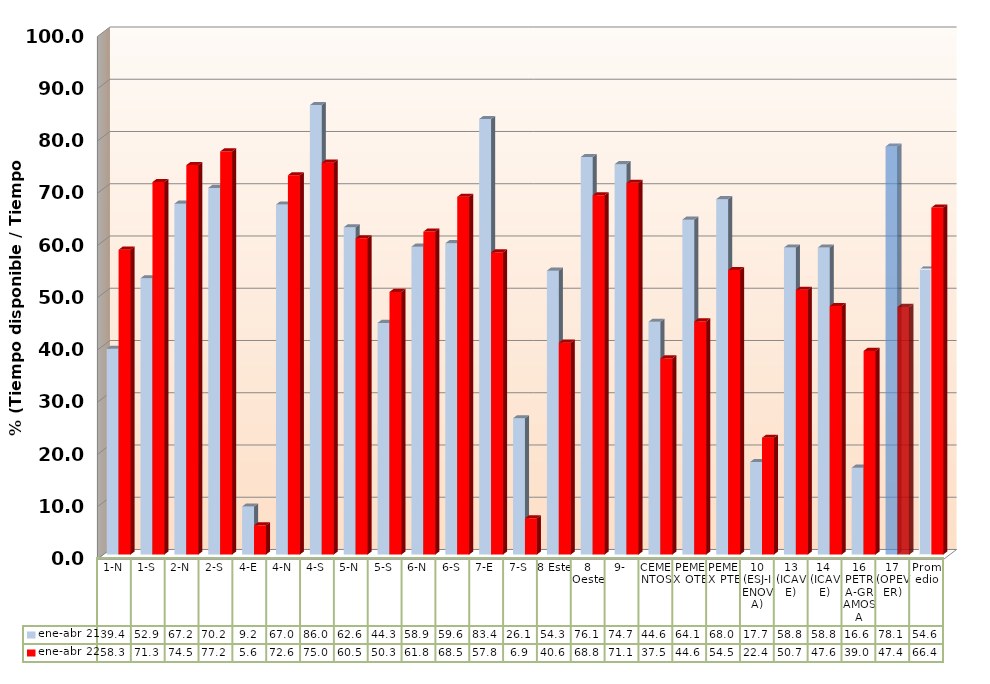
| Category | ene-abr 21 | ene-abr 22 |
|---|---|---|
| 1-N | 39.38 | 58.348 |
| 1-S | 52.884 | 71.292 |
| 2-N | 67.155 | 74.534 |
| 2-S | 70.172 | 77.151 |
| 4-E | 9.195 | 5.589 |
| 4-N | 66.994 | 72.596 |
| 4-S | 86.015 | 74.999 |
| 5-N | 62.631 | 60.538 |
| 5-S | 44.331 | 50.257 |
| 6-N | 58.917 | 61.807 |
| 6-S | 59.587 | 68.472 |
| 7-E | 83.36 | 57.828 |
| 7-S | 26.081 | 6.944 |
| 8 Este | 54.327 | 40.553 |
| 8 Oeste | 76.088 | 68.762 |
| 9- | 74.708 | 71.138 |
| CEMENTOS | 44.552 | 37.54 |
| PEMEX OTE | 64.096 | 44.622 |
| PEMEX PTE | 68.018 | 54.46 |
| 10 (ESJ-IENOVA) | 17.707 | 22.354 |
| 13 (ICAVE) | 58.758 | 50.665 |
| 14  (ICAVE) | 58.758 | 47.563 |
| 16 PETRA-GRAMOSA | 16.624 | 38.972 |
| 17 (OPEVER) | 78.093 | 47.386 |
| Promedio | 54.644 | 66.401 |